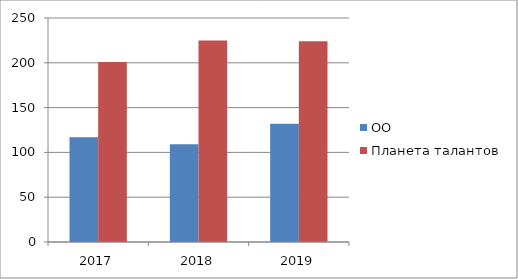
| Category | ОО | Планета талантов |
|---|---|---|
| 2017.0 | 117 | 201 |
| 2018.0 | 109 | 225 |
| 2019.0 | 132 | 224 |